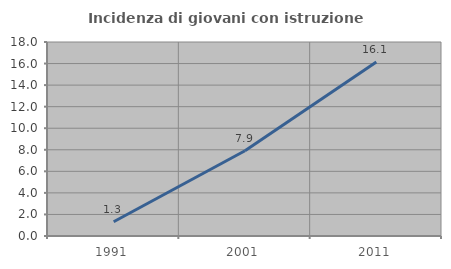
| Category | Incidenza di giovani con istruzione universitaria |
|---|---|
| 1991.0 | 1.325 |
| 2001.0 | 7.907 |
| 2011.0 | 16.149 |